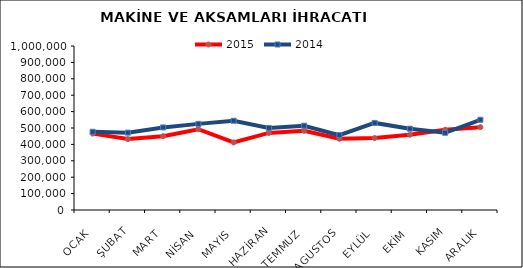
| Category | 2015 | 2014 |
|---|---|---|
| OCAK | 465746.42 | 476954.914 |
| ŞUBAT | 432354.753 | 471697.6 |
| MART | 450342.505 | 503588.762 |
| NİSAN | 492683.552 | 525173.964 |
| MAYIS | 411908.475 | 544227.777 |
| HAZİRAN | 470045.594 | 500227.133 |
| TEMMUZ | 482815.177 | 513955.241 |
| AGUSTOS | 434474.98 | 456634.762 |
| EYLÜL | 438625.067 | 531047.345 |
| EKİM | 458779.359 | 495849.095 |
| KASIM | 489265.137 | 470826.586 |
| ARALIK | 505010.133 | 550123.164 |